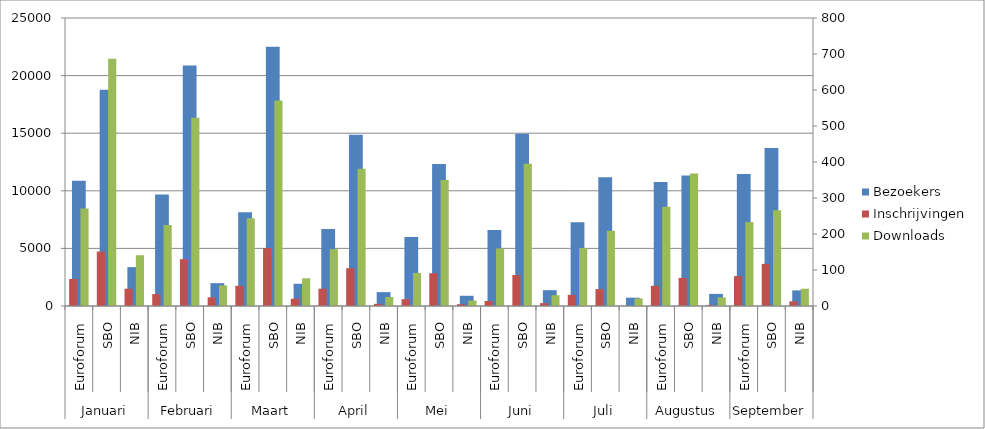
| Category | Bezoekers |
|---|---|
| 0 | 10874 |
| 1 | 18777 |
| 2 | 3374 |
| 3 | 9676 |
| 4 | 20877 |
| 5 | 1982 |
| 6 | 8147 |
| 7 | 22503 |
| 8 | 1929 |
| 9 | 6679 |
| 10 | 14864 |
| 11 | 1205 |
| 12 | 5995 |
| 13 | 12336 |
| 14 | 886 |
| 15 | 6590 |
| 16 | 14943 |
| 17 | 1376 |
| 18 | 7280 |
| 19 | 11172 |
| 20 | 721 |
| 21 | 10757 |
| 22 | 11332 |
| 23 | 1049 |
| 24 | 11460 |
| 25 | 13719 |
| 26 | 1355 |